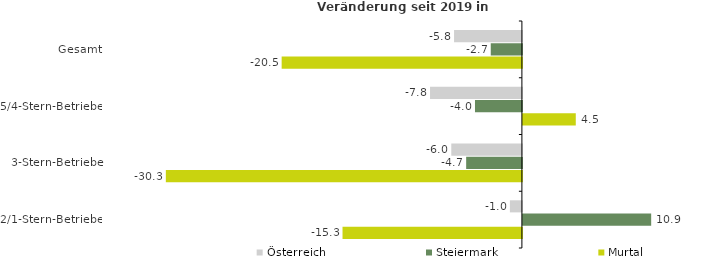
| Category | Österreich | Steiermark | Murtal |
|---|---|---|---|
| Gesamt | -5.779 | -2.653 | -20.464 |
| 5/4-Stern-Betriebe | -7.825 | -3.996 | 4.504 |
| 3-Stern-Betriebe | -6.014 | -4.748 | -30.329 |
| 2/1-Stern-Betriebe | -1.021 | 10.926 | -15.279 |